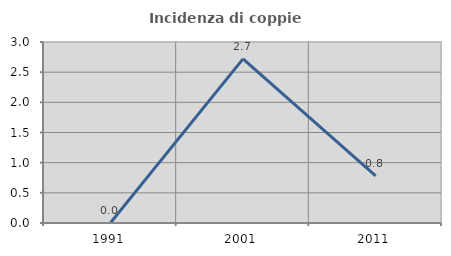
| Category | Incidenza di coppie miste |
|---|---|
| 1991.0 | 0 |
| 2001.0 | 2.721 |
| 2011.0 | 0.781 |